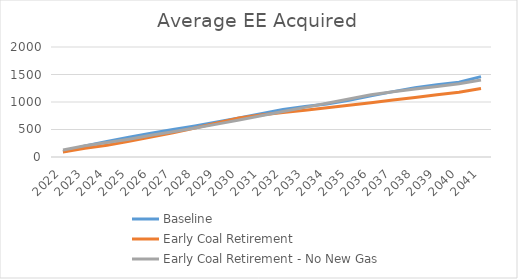
| Category | Baseline  | Early Coal Retirement | Early Coal Retirement - No New Gas |
|---|---|---|---|
| 2022.0 | 94.965 | 89.308 | 126.894 |
| 2023.0 | 201.115 | 157.282 | 204.279 |
| 2024.0 | 281.695 | 214.699 | 261.695 |
| 2025.0 | 359.511 | 288.079 | 324.192 |
| 2026.0 | 434.397 | 362.694 | 395.188 |
| 2027.0 | 499.705 | 441.958 | 460.496 |
| 2028.0 | 566.231 | 527.48 | 527.022 |
| 2029.0 | 637.164 | 617.729 | 597.955 |
| 2030.0 | 711.495 | 711.693 | 672.286 |
| 2031.0 | 787.625 | 765.561 | 748.417 |
| 2032.0 | 864.964 | 807.49 | 825.755 |
| 2033.0 | 917.127 | 850.888 | 902.65 |
| 2034.0 | 961.808 | 895.569 | 978.965 |
| 2035.0 | 1032.092 | 941.02 | 1054.498 |
| 2036.0 | 1110.854 | 988.114 | 1130.789 |
| 2037.0 | 1188.781 | 1035.853 | 1187.996 |
| 2038.0 | 1260.444 | 1083.321 | 1235.465 |
| 2039.0 | 1313.439 | 1130.736 | 1282.88 |
| 2040.0 | 1360.914 | 1178.211 | 1330.355 |
| 2041.0 | 1461.604 | 1245.032 | 1401.724 |